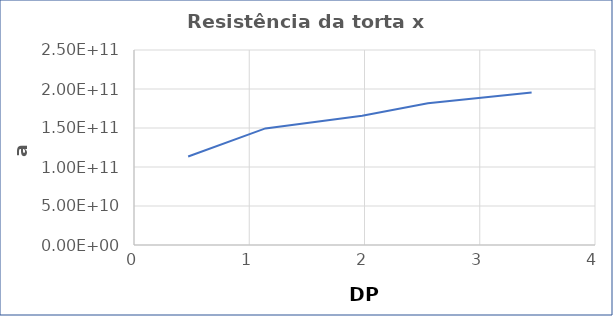
| Category | Series 0 |
|---|---|
| 0.47 | 113452935464.203 |
| 1.14 | 149454142103.68 |
| 1.98 | 165741671442.661 |
| 2.55 | 181759478700.015 |
| 3.45 | 195519252425.139 |